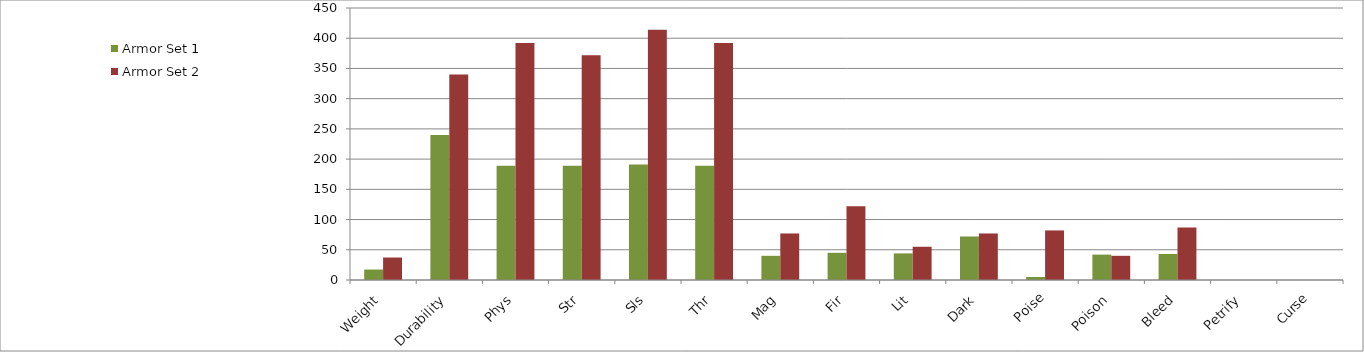
| Category | Armor Set 1 | Armor Set 2 |
|---|---|---|
| Weight | 17.3 | 37.2 |
| Durability | 240 | 340 |
| Phys | 189 | 392 |
| Str | 189 | 372 |
| Sls | 191 | 414 |
| Thr | 189 | 392 |
| Mag | 40 | 77 |
| Fir | 45 | 122 |
| Lit | 44 | 55 |
| Dark | 72 | 77 |
| Poise | 5 | 82 |
| Poison | 42 | 40 |
| Bleed | 43 | 87 |
| Petrify | 0 | 0 |
| Curse | 0 | 0 |